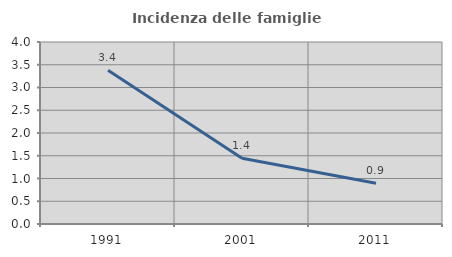
| Category | Incidenza delle famiglie numerose |
|---|---|
| 1991.0 | 3.378 |
| 2001.0 | 1.444 |
| 2011.0 | 0.896 |